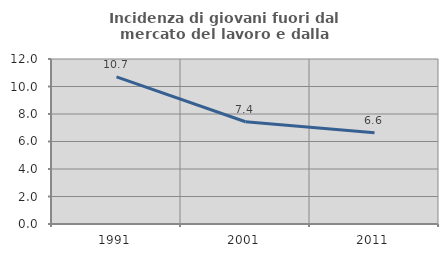
| Category | Incidenza di giovani fuori dal mercato del lavoro e dalla formazione  |
|---|---|
| 1991.0 | 10.694 |
| 2001.0 | 7.435 |
| 2011.0 | 6.637 |